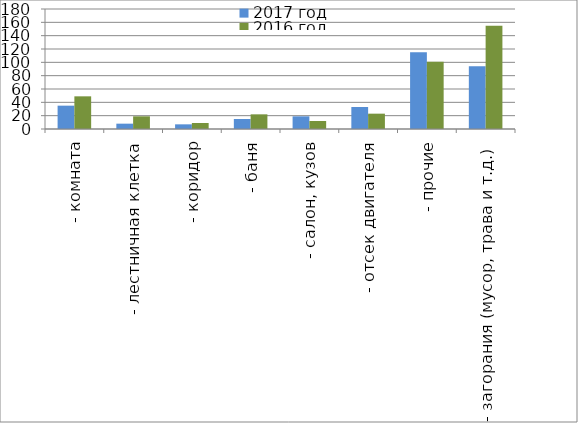
| Category | 2017 год | 2016 год |
|---|---|---|
|  - комната | 35 | 49 |
|  - лестничная клетка | 8 | 19 |
|  - коридор | 7 | 9 |
|  - баня | 15 | 22 |
|  - салон, кузов | 19 | 12 |
|  - отсек двигателя | 33 | 23 |
| - прочие | 115 | 101 |
| - загорания (мусор, трава и т.д.)  | 94 | 155 |